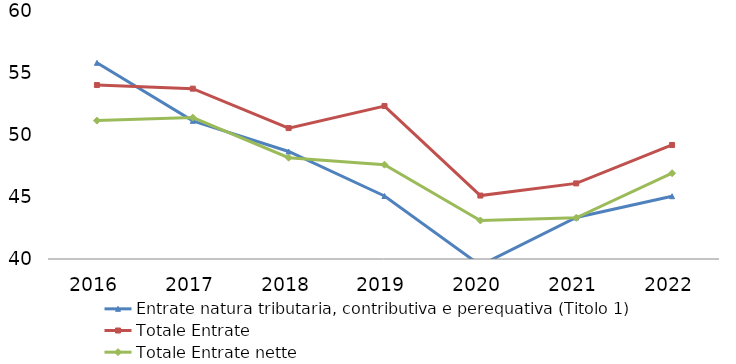
| Category | Entrate natura tributaria, contributiva e perequativa (Titolo 1) | Totale Entrate | Totale Entrate nette |
|---|---|---|---|
| 2016.0 | 55.82 | 54.029 | 51.16 |
| 2017.0 | 51.14 | 53.737 | 51.403 |
| 2018.0 | 48.67 | 50.557 | 48.169 |
| 2019.0 | 45.08 | 52.334 | 47.605 |
| 2020.0 | 39.49 | 45.115 | 43.108 |
| 2021.0 | 43.35 | 46.098 | 43.321 |
| 2022.0 | 45.063 | 49.196 | 46.92 |